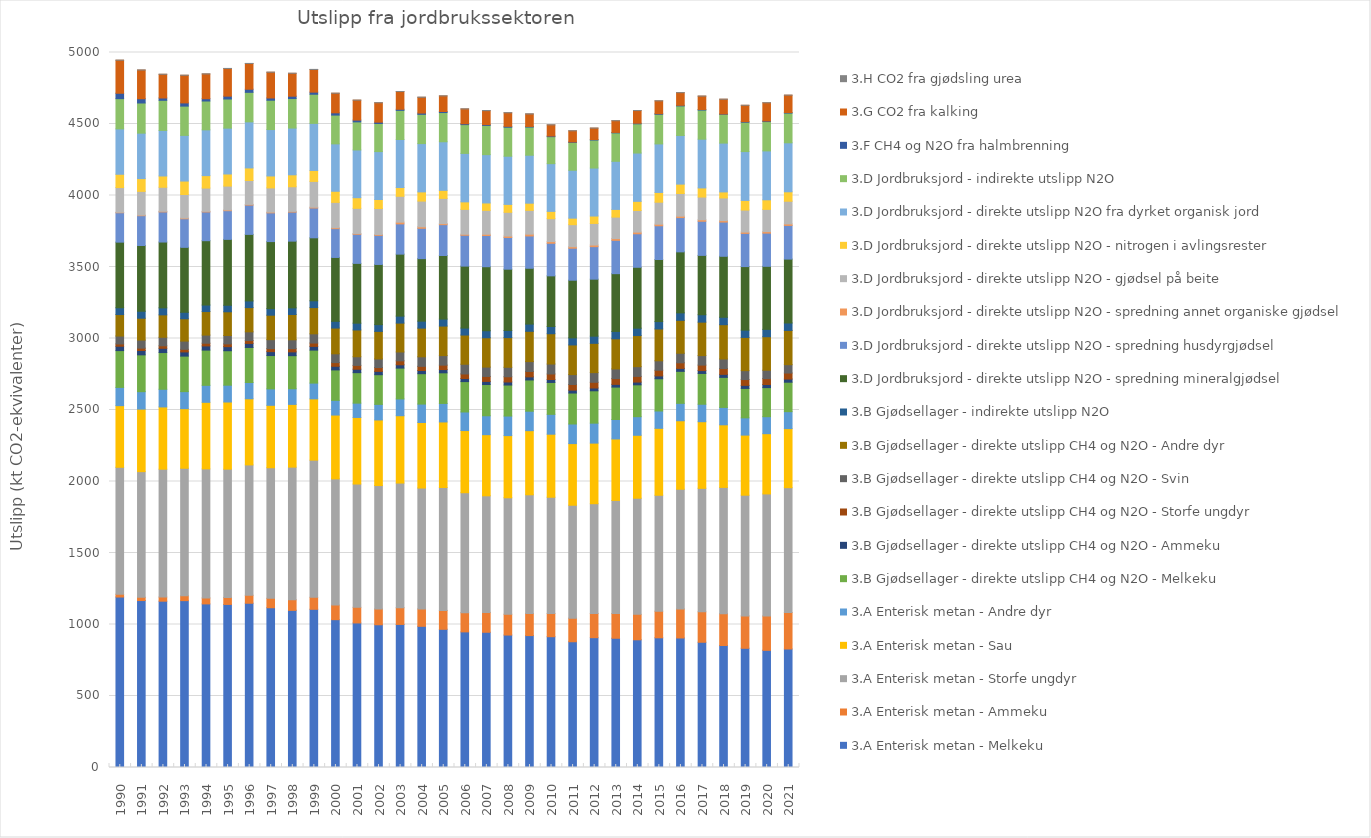
| Category | 3.A Enterisk metan - Melkeku | 3.A Enterisk metan - Ammeku | 3.A Enterisk metan - Storfe ungdyr | 3.A Enterisk metan - Sau | 3.A Enterisk metan - Andre dyr | 3.B Gjødsellager - direkte utslipp CH4 og N2O - Melkeku | 3.B Gjødsellager - direkte utslipp CH4 og N2O - Ammeku | 3.B Gjødsellager - direkte utslipp CH4 og N2O - Storfe ungdyr | 3.B Gjødsellager - direkte utslipp CH4 og N2O - Svin | 3.B Gjødsellager - direkte utslipp CH4 og N2O - Andre dyr | 3.B Gjødsellager - indirekte utslipp N2O | 3.D Jordbruksjord - direkte utslipp N2O - spredning mineralgjødsel | 3.D Jordbruksjord - direkte utslipp N2O - spredning husdyrgjødsel | 3.D Jordbruksjord - direkte utslipp N2O - spredning annet organiske gjødsel | 3.D Jordbruksjord - direkte utslipp N2O - gjødsel på beite | 3.D Jordbruksjord - direkte utslipp N2O - nitrogen i avlingsrester | 3.D Jordbruksjord - direkte utslipp N2O fra dyrket organisk jord | 3.D Jordbruksjord - indirekte utslipp N2O | 3.F CH4 og N2O fra halmbrenning | 3.G CO2 fra kalking | 3.H CO2 fra gjødsling urea |
|---|---|---|---|---|---|---|---|---|---|---|---|---|---|---|---|---|---|---|---|---|---|
| 1990.0 | 1192.096 | 19.729 | 887.637 | 431.003 | 127.547 | 257.414 | 30.503 | 15.841 | 55.483 | 150.133 | 47.608 | 458.829 | 205.579 | 3.071 | 173.004 | 93.078 | 317.139 | 211.479 | 37.863 | 230.971 | 0.553 |
| 1991.0 | 1167.5 | 22.881 | 878.616 | 437.191 | 121.972 | 257.51 | 30.33 | 16.626 | 56.31 | 152.941 | 48.724 | 459.727 | 208.429 | 3.908 | 166.168 | 89.287 | 317.832 | 211.012 | 29.762 | 200.642 | 0.553 |
| 1992.0 | 1163.016 | 28.773 | 894.265 | 435.364 | 123.491 | 256.804 | 29.822 | 17.31 | 59.729 | 156.686 | 49.077 | 460.233 | 210.531 | 4.449 | 167.952 | 79.016 | 318.524 | 210.589 | 16.201 | 165.651 | 0.553 |
| 1993.0 | 1166.887 | 33.322 | 892.356 | 416.771 | 119.211 | 248.279 | 29.47 | 18.115 | 57.434 | 156.02 | 45.456 | 454.121 | 199.937 | 4.686 | 165 | 93.968 | 319.217 | 204.799 | 22.387 | 193.266 | 0.553 |
| 1994.0 | 1143.943 | 41.733 | 902.55 | 465.481 | 118.721 | 246.513 | 29.187 | 18.836 | 56.858 | 164.543 | 45.573 | 449.957 | 200.934 | 4.454 | 162.614 | 87.185 | 319.909 | 201.782 | 16.072 | 173.17 | 0.553 |
| 1995.0 | 1140.341 | 48.964 | 897.144 | 469.353 | 117.683 | 240.959 | 28.651 | 19.159 | 58.75 | 165.719 | 45.785 | 460.698 | 200.57 | 4.896 | 167.185 | 84.65 | 320.602 | 203.706 | 19.911 | 193.307 | 0.553 |
| 1996.0 | 1148.682 | 55.832 | 911.447 | 462.471 | 113.772 | 245.093 | 28.509 | 19.849 | 61.01 | 169.321 | 46.699 | 465.32 | 204.769 | 4.983 | 167.032 | 87.974 | 322.189 | 206.498 | 21.728 | 179.906 | 0.553 |
| 1997.0 | 1117.221 | 66.09 | 912.938 | 436.467 | 114.933 | 233.119 | 27.551 | 20.77 | 62.83 | 171.136 | 45.715 | 469.012 | 200.769 | 4.988 | 169.528 | 83.592 | 324.53 | 205.09 | 15.634 | 180.072 | 0.553 |
| 1998.0 | 1098.84 | 74.381 | 927.279 | 438.698 | 109.306 | 231.303 | 26.748 | 22.264 | 62.098 | 177.005 | 46.318 | 466.657 | 203.045 | 5.056 | 172.131 | 83.59 | 326.872 | 206.358 | 16.416 | 160.073 | 0.553 |
| 1999.0 | 1106.189 | 83.909 | 959.207 | 428.637 | 110.218 | 230.591 | 26.096 | 23.437 | 64.391 | 183.525 | 47.588 | 440.397 | 208.346 | 5.627 | 180.245 | 76.697 | 329.214 | 203.71 | 14.747 | 158.506 | 0.553 |
| 2000.0 | 1033.829 | 101.916 | 882.618 | 446.315 | 102.771 | 212.92 | 25.374 | 25.783 | 61.435 | 180.16 | 47.02 | 446.635 | 201.539 | 6.27 | 177.185 | 77.726 | 331.556 | 201.321 | 15.713 | 137.107 | 0.112 |
| 2001.0 | 1010.891 | 109.123 | 862.223 | 465.553 | 100.113 | 213.179 | 24.199 | 26.712 | 60.428 | 187.322 | 47.362 | 418.175 | 203.522 | 5.695 | 175.726 | 74.349 | 333.898 | 196.465 | 12.388 | 139.482 | 0.075 |
| 2002.0 | 998.071 | 110.361 | 863.272 | 458.675 | 108.867 | 207.531 | 23.308 | 26.828 | 60.069 | 192.722 | 47.184 | 420.889 | 203.53 | 6.161 | 181.216 | 63.439 | 334.874 | 196.544 | 9.283 | 135.639 | 0.426 |
| 2003.0 | 1000.429 | 117.335 | 871.366 | 470.878 | 117.335 | 215.617 | 23.101 | 27.881 | 61.857 | 201.973 | 48.766 | 433.399 | 211.618 | 11.91 | 181.047 | 61.163 | 335.85 | 203.681 | 7.794 | 123.874 | 0.075 |
| 2004.0 | 987.29 | 121.857 | 845.149 | 458.392 | 128.769 | 212.447 | 22.385 | 29.08 | 66.568 | 200.654 | 48.635 | 437.326 | 212.192 | 10.271 | 179.95 | 64.274 | 337.801 | 204.607 | 8.745 | 110.248 | 1.216 |
| 2005.0 | 966.431 | 132.057 | 859.631 | 458.339 | 129.43 | 214.056 | 22.763 | 31.139 | 66.673 | 206.422 | 48.905 | 444.736 | 215.395 | 7.367 | 176.387 | 56.295 | 339.753 | 204.258 | 7.337 | 109.179 | 0.1 |
| 2006.0 | 948.4 | 134.14 | 838.981 | 434.779 | 129.918 | 212.344 | 21.573 | 31.953 | 67.954 | 204.114 | 48.833 | 433.296 | 215.594 | 7.189 | 173.727 | 52.748 | 338.777 | 201.282 | 6.131 | 103.801 | 0.124 |
| 2007.0 | 945.749 | 138.722 | 815.373 | 427.614 | 132.176 | 218.457 | 21.761 | 34.933 | 65.296 | 204.989 | 49.214 | 447.686 | 218.129 | 9.082 | 166.831 | 51.818 | 337.873 | 204.296 | 5.82 | 97.479 | 1.175 |
| 2008.0 | 926.242 | 145.446 | 814.401 | 434.901 | 136.727 | 216.849 | 21.438 | 36.529 | 66.159 | 207.374 | 50.1 | 428.59 | 221.586 | 10.089 | 166.096 | 55.227 | 336.969 | 202.706 | 6.148 | 94.83 | 0.893 |
| 2009.0 | 922.425 | 153.638 | 830.952 | 448.495 | 136.066 | 218.551 | 21.62 | 37.852 | 68.812 | 211.878 | 50.67 | 390.232 | 225.891 | 12.572 | 166.502 | 50.148 | 335.383 | 197.006 | 4.243 | 86.921 | 1.348 |
| 2010.0 | 914.631 | 161.601 | 813.672 | 440.908 | 138.835 | 222.958 | 20.566 | 38.683 | 69.665 | 211.777 | 50.735 | 354.036 | 227.936 | 11.613 | 160.116 | 51.221 | 333.796 | 188.808 | 4.379 | 78.007 | 0.325 |
| 2011.0 | 879.351 | 165.042 | 789.58 | 431.122 | 137.033 | 216.523 | 20.373 | 39.363 | 69.023 | 207.508 | 49.629 | 403.011 | 223.865 | 10.47 | 154.052 | 45.672 | 334.88 | 194.657 | 3.312 | 77.934 | 0.328 |
| 2012.0 | 907.856 | 169.605 | 767.255 | 423.777 | 139.517 | 226.256 | 19.672 | 39.859 | 67.574 | 204.842 | 50.182 | 398.449 | 227.487 | 11.386 | 150.856 | 51.862 | 335.635 | 195.772 | 3.509 | 79.873 | 0.226 |
| 2013.0 | 903.765 | 172.976 | 790.91 | 429.972 | 135.943 | 226.652 | 19.081 | 40.302 | 67.61 | 210.796 | 51.359 | 403.977 | 233.19 | 12.247 | 150.154 | 53.735 | 336.39 | 198.967 | 3.109 | 81.665 | 0.16 |
| 2014.0 | 893.017 | 177.937 | 812.153 | 440.005 | 130.101 | 222.754 | 19.369 | 39.632 | 68.044 | 217.623 | 51.595 | 425.748 | 234.342 | 11.737 | 151.061 | 63.924 | 337.888 | 204.459 | 3.983 | 88.607 | 0.163 |
| 2015.0 | 906.932 | 186.398 | 810.459 | 468.03 | 121.261 | 225.259 | 20.209 | 39.465 | 66.011 | 222.613 | 51.644 | 433.977 | 236.163 | 10.871 | 153.843 | 68.225 | 339.386 | 207.167 | 4.38 | 89.677 | 0.216 |
| 2016.0 | 905.726 | 203.168 | 836.947 | 479.028 | 121.753 | 223.687 | 20.696 | 38.984 | 66.894 | 230.071 | 52.215 | 426.674 | 239.663 | 10.262 | 158.203 | 65.717 | 340.166 | 206.649 | 4.278 | 88.313 | 0.189 |
| 2017.0 | 875.843 | 212.703 | 863.578 | 465.962 | 122.122 | 215.305 | 20.107 | 38.562 | 66.269 | 233.853 | 51.869 | 415.071 | 238.681 | 10.291 | 158.941 | 63.754 | 340.811 | 203.676 | 4.218 | 93.441 | 0.092 |
| 2018.0 | 853.181 | 222.268 | 883.268 | 437.721 | 121.541 | 210.203 | 21.111 | 40.557 | 66.92 | 239.785 | 51.926 | 426.39 | 239.31 | 10.22 | 158.37 | 42.253 | 341.457 | 201.504 | 2.401 | 102.906 | 0.103 |
| 2019.0 | 833.576 | 226.354 | 844.276 | 420.279 | 120.581 | 205.723 | 21.481 | 40.783 | 62.076 | 232.254 | 50.93 | 444.601 | 232.222 | 9.189 | 153.611 | 67.483 | 341.731 | 205.112 | 4.198 | 114.301 | 0.104 |
| 2020.0 | 819.262 | 240.193 | 853.603 | 421.364 | 118.787 | 203.409 | 21.56 | 41.266 | 58.641 | 234.354 | 51.428 | 440.932 | 232.121 | 10.615 | 155.41 | 66.906 | 342.005 | 205.054 | 4.246 | 127.323 | 0.082 |
| 2021.0 | 828.727 | 255.445 | 872.542 | 413.152 | 118.491 | 205.972 | 22.112 | 42.117 | 58.336 | 239.52 | 52.105 | 446.754 | 235.418 | 10.574 | 158.682 | 65.905 | 342.638 | 207.911 | 3.646 | 121.562 | 0.096 |